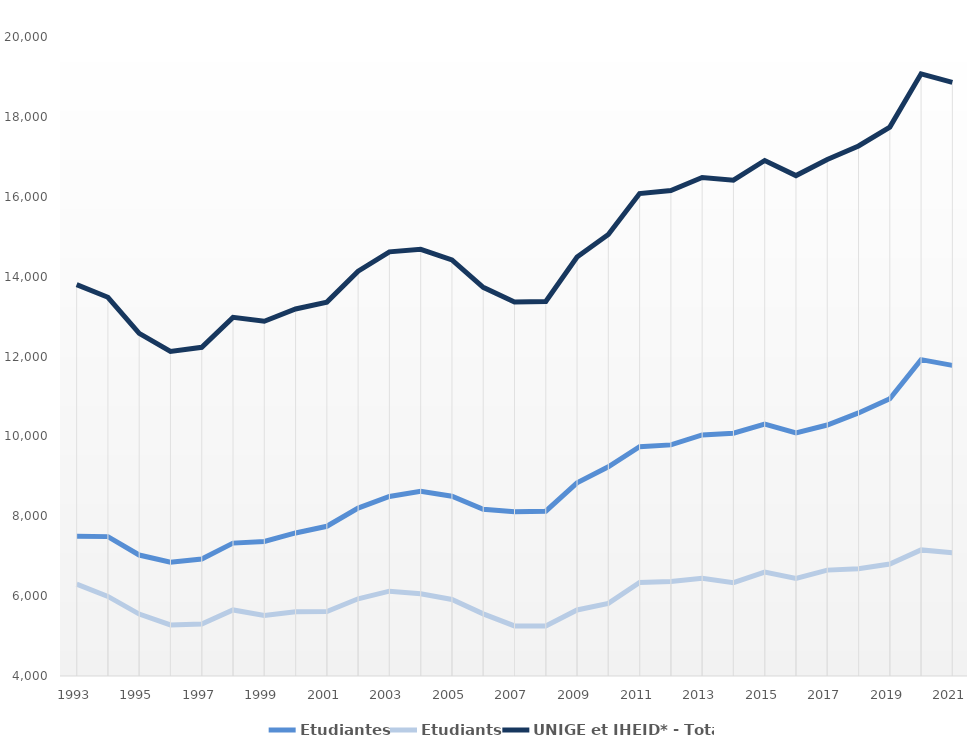
| Category | Etudiantes | Etudiants | UNIGE et IHEID* - Total |
|---|---|---|---|
| 1993 | 7498 | 6302 | 13800 |
| 1994 | 7490 | 5993 | 13483 |
| 1995 | 7029 | 5551 | 12580 |
| 1996 | 6847 | 5279 | 12126 |
| 1997 | 6928 | 5302 | 12230 |
| 1998 | 7327 | 5654 | 12981 |
| 1999 | 7369 | 5514 | 12883 |
| 2000 | 7582 | 5609 | 13191 |
| 2001 | 7749 | 5612 | 13361 |
| 2002 | 8205 | 5933 | 14138 |
| 2003 | 8496 | 6124 | 14620 |
| 2004 | 8628 | 6057 | 14685 |
| 2005 | 8501 | 5917 | 14418 |
| 2006 | 8176 | 5556 | 13732 |
| 2007 | 8110 | 5254 | 13364 |
| 2008 | 8126 | 5253 | 13379 |
| 2009 | 8836 | 5653 | 14489 |
| 2010 | 9238 | 5819 | 15057 |
| 2011 | 9740 | 6341 | 16081 |
| 2012 | 9787 | 6367 | 16154 |
| 2013 | 10037 | 6447 | 16484 |
| 2014 | 10078 | 6338 | 16416 |
| 2015 | 10308 | 6600 | 16908 |
| 2016 | 10088 | 6442 | 16530 |
| 2017 | 10284 | 6651 | 16935 |
| 2018 | 10587 | 6684 | 17271 |
| 2019 | 10940 | 6804 | 17744 |
| 2020 | 11921 | 7157 | 19078 |
| 2021 | 11778 | 7087 | 18865 |